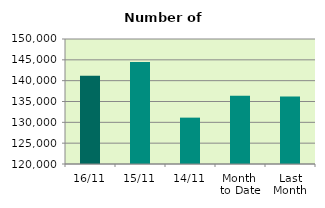
| Category | Series 0 |
|---|---|
| 16/11 | 141152 |
| 15/11 | 144464 |
| 14/11 | 131128 |
| Month 
to Date | 136397.833 |
| Last
Month | 136171.238 |